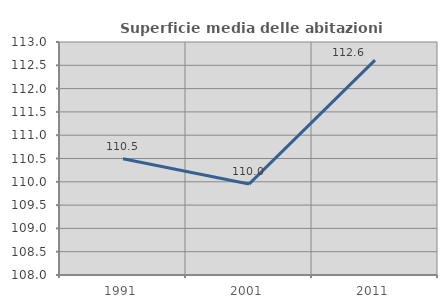
| Category | Superficie media delle abitazioni occupate |
|---|---|
| 1991.0 | 110.495 |
| 2001.0 | 109.951 |
| 2011.0 | 112.611 |